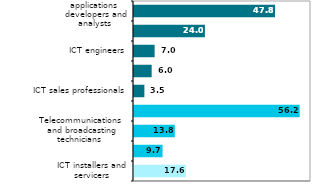
| Category | 2017 |
|---|---|
| ICT installers and servicers | 17.584 |
| Electronics engineering technicians | 9.68 |
| Telecommunications 
and broadcasting technicians  | 13.844 |
| ICT operations & and user support 
technicians | 56.158 |
| ICT sales professionals | 3.522 |
| ICT service managers | 5.99 |
| ICT engineers | 6.993 |
| Database & network 
professionals | 24.04 |
| Software & applications 
developers and analysts  | 47.818 |